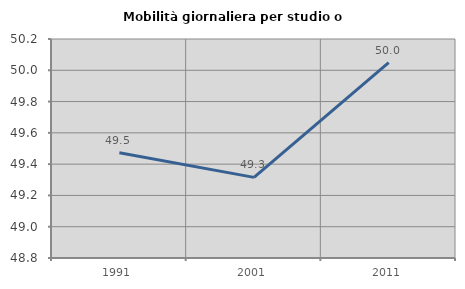
| Category | Mobilità giornaliera per studio o lavoro |
|---|---|
| 1991.0 | 49.473 |
| 2001.0 | 49.315 |
| 2011.0 | 50.049 |